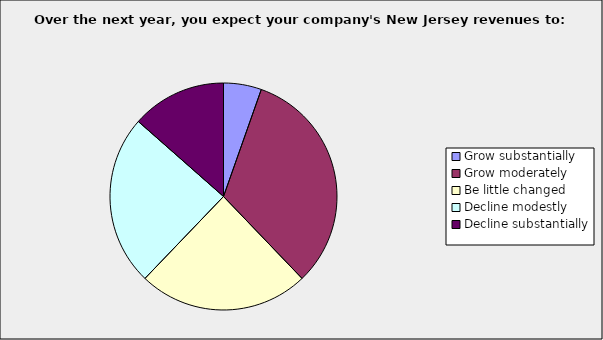
| Category | Series 0 |
|---|---|
| Grow substantially | 0.054 |
| Grow moderately | 0.324 |
| Be little changed | 0.243 |
| Decline modestly | 0.243 |
| Decline substantially | 0.135 |